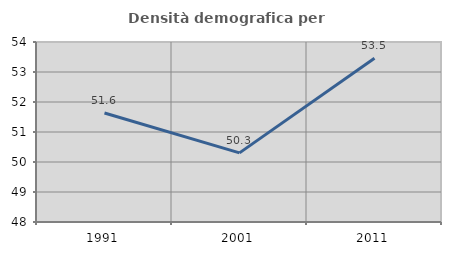
| Category | Densità demografica |
|---|---|
| 1991.0 | 51.633 |
| 2001.0 | 50.305 |
| 2011.0 | 53.459 |